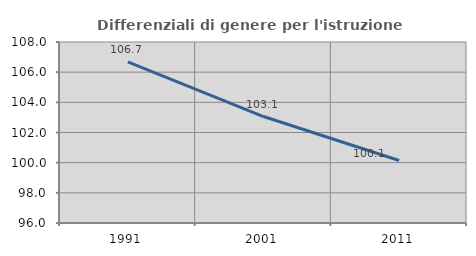
| Category | Differenziali di genere per l'istruzione superiore |
|---|---|
| 1991.0 | 106.682 |
| 2001.0 | 103.058 |
| 2011.0 | 100.141 |